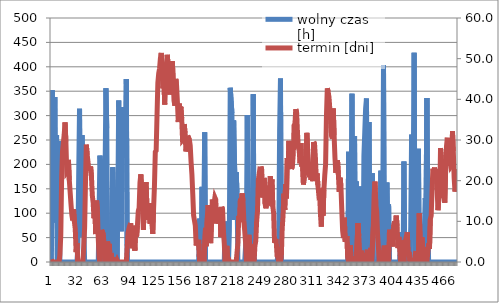
| Category | wolny czas [h] |
|---|---|
| 0 | 0 |
| 1 | 352 |
| 2 | 124 |
| 3 | 181 |
| 4 | 338 |
| 5 | 81 |
| 6 | 260 |
| 7 | 3 |
| 8 | 248 |
| 9 | 95 |
| 10 | 0 |
| 11 | 0 |
| 12 | 0 |
| 13 | 0 |
| 14 | 0 |
| 15 | 0 |
| 16 | 0 |
| 17 | 0 |
| 18 | 0 |
| 19 | 0 |
| 20 | 0 |
| 21 | 0 |
| 22 | 0 |
| 23 | 0 |
| 24 | 0 |
| 25 | 0 |
| 26 | 0 |
| 27 | 0 |
| 28 | 0 |
| 29 | 0 |
| 30 | 0 |
| 31 | 30 |
| 32 | 174 |
| 33 | 314 |
| 34 | 52 |
| 35 | 99 |
| 36 | 260 |
| 37 | 154 |
| 38 | 77 |
| 39 | 0 |
| 40 | 0 |
| 41 | 0 |
| 42 | 0 |
| 43 | 0 |
| 44 | 0 |
| 45 | 0 |
| 46 | 0 |
| 47 | 0 |
| 48 | 0 |
| 49 | 0 |
| 50 | 0 |
| 51 | 0 |
| 52 | 0 |
| 53 | 0 |
| 54 | 0 |
| 55 | 0 |
| 56 | 0 |
| 57 | 218 |
| 58 | 182 |
| 59 | 0 |
| 60 | 0 |
| 61 | 0 |
| 62 | 0 |
| 63 | 181 |
| 64 | 356 |
| 65 | 274 |
| 66 | 0 |
| 67 | 77 |
| 68 | 0 |
| 69 | 21 |
| 70 | 0 |
| 71 | 1 |
| 72 | 194 |
| 73 | 140 |
| 74 | 8 |
| 75 | 0 |
| 76 | 115 |
| 77 | 0 |
| 78 | 115 |
| 79 | 331 |
| 80 | 271 |
| 81 | 312 |
| 82 | 63 |
| 83 | 305 |
| 84 | 214 |
| 85 | 317 |
| 86 | 239 |
| 87 | 223 |
| 88 | 375 |
| 89 | 0 |
| 90 | 0 |
| 91 | 0 |
| 92 | 0 |
| 93 | 0 |
| 94 | 0 |
| 95 | 0 |
| 96 | 0 |
| 97 | 0 |
| 98 | 0 |
| 99 | 0 |
| 100 | 0 |
| 101 | 0 |
| 102 | 0 |
| 103 | 0 |
| 104 | 0 |
| 105 | 0 |
| 106 | 0 |
| 107 | 0 |
| 108 | 0 |
| 109 | 0 |
| 110 | 0 |
| 111 | 0 |
| 112 | 0 |
| 113 | 0 |
| 114 | 0 |
| 115 | 0 |
| 116 | 0 |
| 117 | 0 |
| 118 | 0 |
| 119 | 0 |
| 120 | 0 |
| 121 | 0 |
| 122 | 0 |
| 123 | 0 |
| 124 | 0 |
| 125 | 0 |
| 126 | 0 |
| 127 | 0 |
| 128 | 0 |
| 129 | 0 |
| 130 | 0 |
| 131 | 0 |
| 132 | 0 |
| 133 | 0 |
| 134 | 0 |
| 135 | 0 |
| 136 | 0 |
| 137 | 0 |
| 138 | 0 |
| 139 | 0 |
| 140 | 0 |
| 141 | 0 |
| 142 | 0 |
| 143 | 0 |
| 144 | 0 |
| 145 | 0 |
| 146 | 0 |
| 147 | 0 |
| 148 | 0 |
| 149 | 0 |
| 150 | 0 |
| 151 | 0 |
| 152 | 0 |
| 153 | 0 |
| 154 | 0 |
| 155 | 0 |
| 156 | 0 |
| 157 | 0 |
| 158 | 0 |
| 159 | 0 |
| 160 | 0 |
| 161 | 0 |
| 162 | 0 |
| 163 | 0 |
| 164 | 0 |
| 165 | 0 |
| 166 | 0 |
| 167 | 0 |
| 168 | 0 |
| 169 | 0 |
| 170 | 0 |
| 171 | 0 |
| 172 | 0 |
| 173 | 0 |
| 174 | 89 |
| 175 | 25 |
| 176 | 0 |
| 177 | 154 |
| 178 | 0 |
| 179 | 103 |
| 180 | 266 |
| 181 | 0 |
| 182 | 0 |
| 183 | 0 |
| 184 | 0 |
| 185 | 0 |
| 186 | 0 |
| 187 | 0 |
| 188 | 0 |
| 189 | 0 |
| 190 | 0 |
| 191 | 0 |
| 192 | 0 |
| 193 | 0 |
| 194 | 0 |
| 195 | 0 |
| 196 | 0 |
| 197 | 0 |
| 198 | 0 |
| 199 | 0 |
| 200 | 0 |
| 201 | 0 |
| 202 | 0 |
| 203 | 0 |
| 204 | 83 |
| 205 | 68 |
| 206 | 0 |
| 207 | 0 |
| 208 | 0 |
| 209 | 64 |
| 210 | 357 |
| 211 | 358 |
| 212 | 305 |
| 213 | 86 |
| 214 | 290 |
| 215 | 204 |
| 216 | 168 |
| 217 | 184 |
| 218 | 142 |
| 219 | 0 |
| 220 | 0 |
| 221 | 0 |
| 222 | 0 |
| 223 | 0 |
| 224 | 0 |
| 225 | 0 |
| 226 | 0 |
| 227 | 0 |
| 228 | 0 |
| 229 | 63 |
| 230 | 301 |
| 231 | 0 |
| 232 | 0 |
| 233 | 0 |
| 234 | 103 |
| 235 | 0 |
| 236 | 98 |
| 237 | 344 |
| 238 | 12 |
| 239 | 0 |
| 240 | 0 |
| 241 | 0 |
| 242 | 0 |
| 243 | 0 |
| 244 | 0 |
| 245 | 0 |
| 246 | 0 |
| 247 | 0 |
| 248 | 0 |
| 249 | 0 |
| 250 | 0 |
| 251 | 0 |
| 252 | 0 |
| 253 | 0 |
| 254 | 0 |
| 255 | 0 |
| 256 | 0 |
| 257 | 0 |
| 258 | 0 |
| 259 | 0 |
| 260 | 0 |
| 261 | 0 |
| 262 | 0 |
| 263 | 0 |
| 264 | 0 |
| 265 | 0 |
| 266 | 0 |
| 267 | 34 |
| 268 | 269 |
| 269 | 376 |
| 270 | 0 |
| 271 | 0 |
| 272 | 0 |
| 273 | 0 |
| 274 | 0 |
| 275 | 0 |
| 276 | 0 |
| 277 | 0 |
| 278 | 0 |
| 279 | 0 |
| 280 | 0 |
| 281 | 0 |
| 282 | 0 |
| 283 | 0 |
| 284 | 0 |
| 285 | 0 |
| 286 | 0 |
| 287 | 0 |
| 288 | 0 |
| 289 | 0 |
| 290 | 0 |
| 291 | 0 |
| 292 | 0 |
| 293 | 0 |
| 294 | 0 |
| 295 | 0 |
| 296 | 0 |
| 297 | 0 |
| 298 | 0 |
| 299 | 0 |
| 300 | 0 |
| 301 | 0 |
| 302 | 0 |
| 303 | 0 |
| 304 | 0 |
| 305 | 0 |
| 306 | 0 |
| 307 | 0 |
| 308 | 0 |
| 309 | 0 |
| 310 | 0 |
| 311 | 0 |
| 312 | 0 |
| 313 | 0 |
| 314 | 0 |
| 315 | 0 |
| 316 | 0 |
| 317 | 0 |
| 318 | 0 |
| 319 | 0 |
| 320 | 0 |
| 321 | 0 |
| 322 | 0 |
| 323 | 0 |
| 324 | 0 |
| 325 | 0 |
| 326 | 0 |
| 327 | 0 |
| 328 | 0 |
| 329 | 0 |
| 330 | 0 |
| 331 | 0 |
| 332 | 0 |
| 333 | 0 |
| 334 | 0 |
| 335 | 0 |
| 336 | 0 |
| 337 | 0 |
| 338 | 0 |
| 339 | 0 |
| 340 | 0 |
| 341 | 0 |
| 342 | 0 |
| 343 | 0 |
| 344 | 0 |
| 345 | 0 |
| 346 | 0 |
| 347 | 0 |
| 348 | 0 |
| 349 | 226 |
| 350 | 0 |
| 351 | 0 |
| 352 | 132 |
| 353 | 345 |
| 354 | 0 |
| 355 | 47 |
| 356 | 258 |
| 357 | 0 |
| 358 | 165 |
| 359 | 31 |
| 360 | 0 |
| 361 | 0 |
| 362 | 0 |
| 363 | 155 |
| 364 | 0 |
| 365 | 0 |
| 366 | 0 |
| 367 | 218 |
| 368 | 266 |
| 369 | 315 |
| 370 | 335 |
| 371 | 0 |
| 372 | 38 |
| 373 | 287 |
| 374 | 0 |
| 375 | 0 |
| 376 | 72 |
| 377 | 182 |
| 378 | 0 |
| 379 | 0 |
| 380 | 0 |
| 381 | 0 |
| 382 | 0 |
| 383 | 0 |
| 384 | 0 |
| 385 | 67 |
| 386 | 0 |
| 387 | 187 |
| 388 | 0 |
| 389 | 54 |
| 390 | 403 |
| 391 | 0 |
| 392 | 0 |
| 393 | 0 |
| 394 | 163 |
| 395 | 68 |
| 396 | 118 |
| 397 | 0 |
| 398 | 0 |
| 399 | 0 |
| 400 | 0 |
| 401 | 0 |
| 402 | 0 |
| 403 | 0 |
| 404 | 0 |
| 405 | 0 |
| 406 | 0 |
| 407 | 0 |
| 408 | 0 |
| 409 | 0 |
| 410 | 61 |
| 411 | 0 |
| 412 | 0 |
| 413 | 0 |
| 414 | 206 |
| 415 | 0 |
| 416 | 0 |
| 417 | 0 |
| 418 | 0 |
| 419 | 0 |
| 420 | 0 |
| 421 | 0 |
| 422 | 73 |
| 423 | 261 |
| 424 | 132 |
| 425 | 200 |
| 426 | 429 |
| 427 | 0 |
| 428 | 0 |
| 429 | 0 |
| 430 | 0 |
| 431 | 232 |
| 432 | 0 |
| 433 | 0 |
| 434 | 4 |
| 435 | 0 |
| 436 | 0 |
| 437 | 0 |
| 438 | 0 |
| 439 | 131 |
| 440 | 116 |
| 441 | 336 |
| 442 | 104 |
| 443 | 0 |
| 444 | 0 |
| 445 | 0 |
| 446 | 0 |
| 447 | 0 |
| 448 | 0 |
| 449 | 0 |
| 450 | 0 |
| 451 | 0 |
| 452 | 0 |
| 453 | 0 |
| 454 | 0 |
| 455 | 0 |
| 456 | 0 |
| 457 | 0 |
| 458 | 0 |
| 459 | 0 |
| 460 | 0 |
| 461 | 0 |
| 462 | 0 |
| 463 | 0 |
| 464 | 0 |
| 465 | 0 |
| 466 | 0 |
| 467 | 0 |
| 468 | 0 |
| 469 | 0 |
| 470 | 0 |
| 471 | 0 |
| 472 | 0 |
| 473 | 0 |
| 474 | 0 |
| 475 | 0 |
| 476 | 0 |
| 477 | 0 |